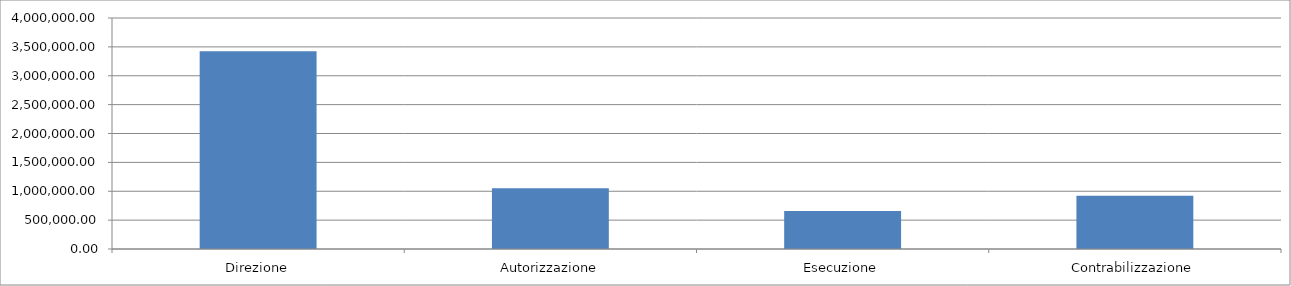
| Category | Series 0 |
|---|---|
| Direzione | 3424085.775 |
| Autorizzazione | 1053564.854 |
| Esecuzione | 658478.034 |
| Contrabilizzazione | 921869.247 |